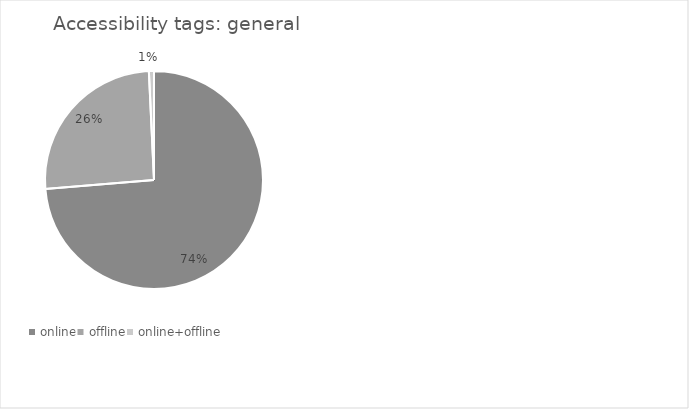
| Category | % |
|---|---|
| online | 0.737 |
| offline | 0.256 |
| online+offline | 0.008 |